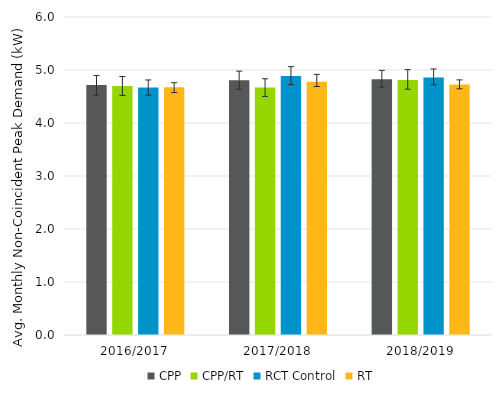
| Category | CPP | CPP/RT | RCT Control | RT |
|---|---|---|---|---|
| 2016/2017 | 4.717 | 4.699 | 4.668 | 4.674 |
| 2017/2018 | 4.807 | 4.67 | 4.888 | 4.778 |
| 2018/2019 | 4.824 | 4.81 | 4.857 | 4.725 |